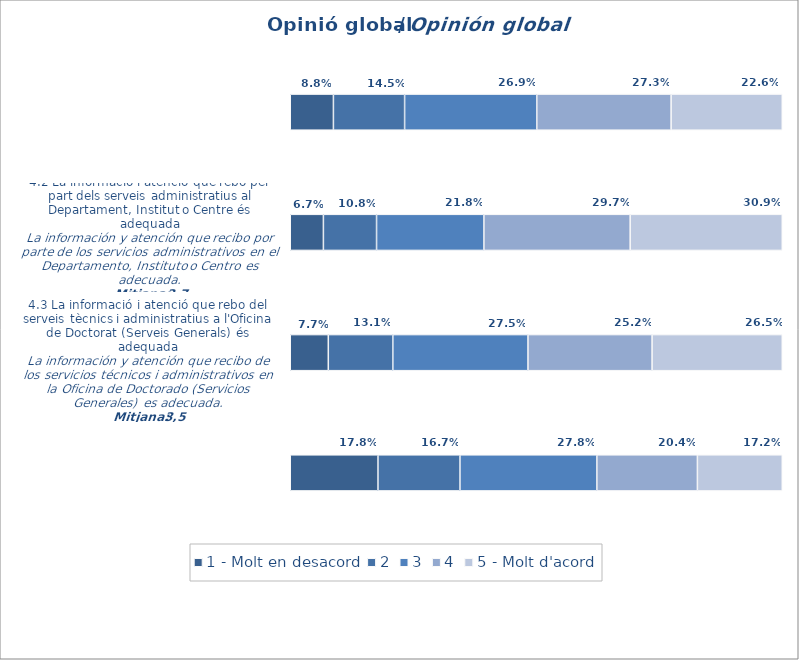
| Category | 1 - Molt en desacord | 2 | 3 | 4 | 5 - Molt d'acord |
|---|---|---|---|---|---|
| 1.0 | 0.088 | 0.145 | 0.269 | 0.273 | 0.226 |
| 2.0 | 0.067 | 0.108 | 0.218 | 0.297 | 0.309 |
| 3.0 | 0.077 | 0.131 | 0.275 | 0.252 | 0.265 |
| 4.0 | 0.178 | 0.167 | 0.278 | 0.204 | 0.172 |